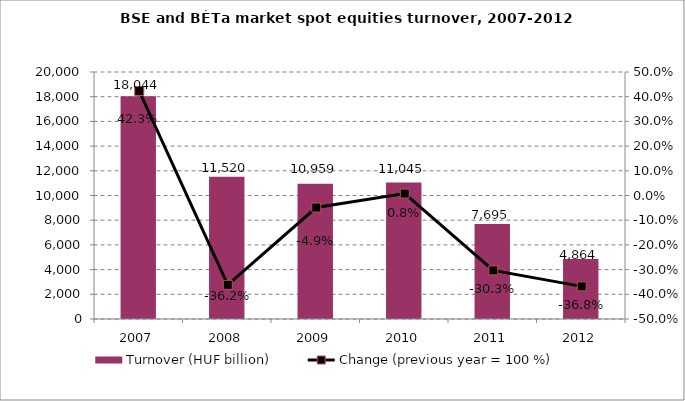
| Category | Turnover (HUF billion) |
|---|---|
| 2007.0 | 18044 |
| 2008.0 | 11520 |
| 2009.0 | 10959 |
| 2010.0 | 11045 |
| 2011.0 | 7695 |
| 2012.0 | 4864 |